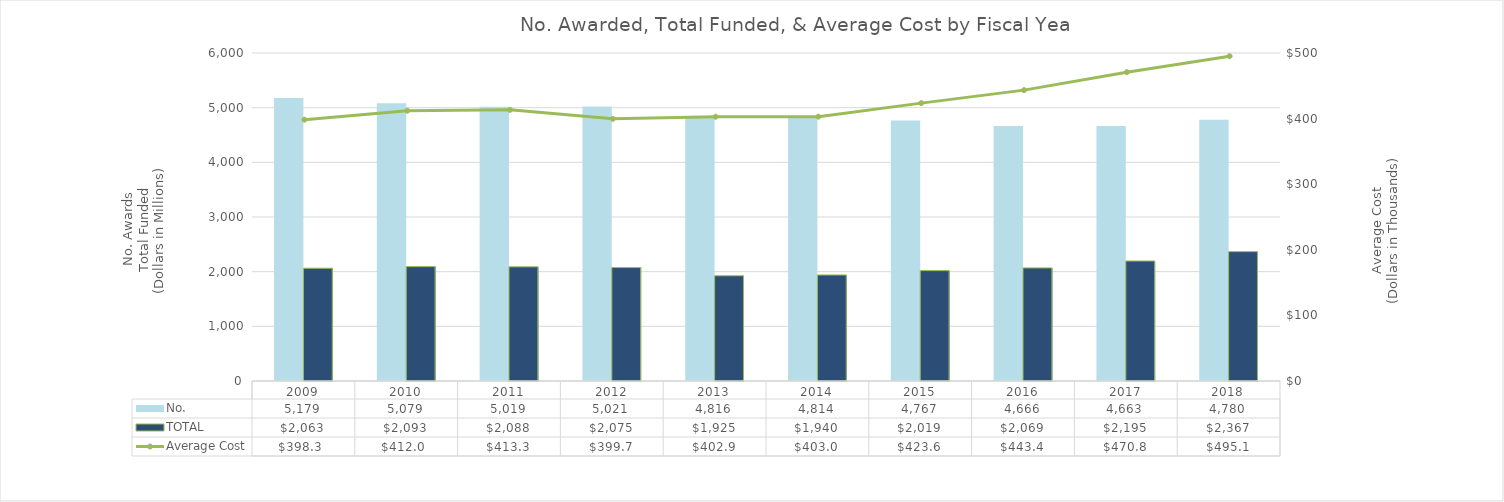
| Category | No. | TOTAL |
|---|---|---|
| 2009.0 | 5179 | 2063.038 |
| 2010.0 | 5079 | 2092.729 |
| 2011.0 | 5019 | 2088.352 |
| 2012.0 | 5021 | 2075.295 |
| 2013.0 | 4816 | 1924.803 |
| 2014.0 | 4814 | 1939.623 |
| 2015.0 | 4767 | 2019.308 |
| 2016.0 | 4666 | 2069 |
| 2017.0 | 4663 | 2195.184 |
| 2018.0 | 4780 | 2366.53 |